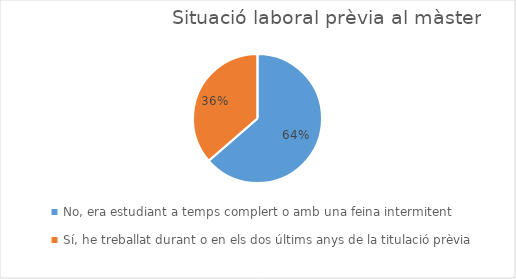
| Category | Series 0 |
|---|---|
| No, era estudiant a temps complert o amb una feina intermitent
 | 28 |
| Sí, he treballat durant o en els dos últims anys de la titulació prèvia | 16 |